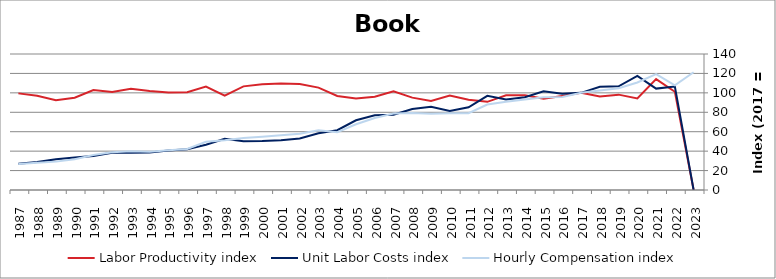
| Category | Labor Productivity index | Unit Labor Costs index | Hourly Compensation index |
|---|---|---|---|
| 2023.0 | 0 | 0 | 121.183 |
| 2022.0 | 101.165 | 106.477 | 107.717 |
| 2021.0 | 114.195 | 104.382 | 119.199 |
| 2020.0 | 94.216 | 117.429 | 110.637 |
| 2019.0 | 98.167 | 106.733 | 104.776 |
| 2018.0 | 96.361 | 106.322 | 102.453 |
| 2017.0 | 100 | 100 | 100 |
| 2016.0 | 96.762 | 99.032 | 95.825 |
| 2015.0 | 93.862 | 101.633 | 95.395 |
| 2014.0 | 97.542 | 95.531 | 93.183 |
| 2013.0 | 97.541 | 93.22 | 90.928 |
| 2012.0 | 90.743 | 96.927 | 87.955 |
| 2011.0 | 92.852 | 85.19 | 79.1 |
| 2010.0 | 97.183 | 81.26 | 78.971 |
| 2009.0 | 91.659 | 85.734 | 78.582 |
| 2008.0 | 95.104 | 83.298 | 79.22 |
| 2007.0 | 101.642 | 77.407 | 78.678 |
| 2006.0 | 96.106 | 77.033 | 74.034 |
| 2005.0 | 94.225 | 71.781 | 67.636 |
| 2004.0 | 96.797 | 61.511 | 59.541 |
| 2003.0 | 105.394 | 58.322 | 61.468 |
| 2002.0 | 109.127 | 53.08 | 57.925 |
| 2001.0 | 109.714 | 51.336 | 56.323 |
| 2000.0 | 108.96 | 50.367 | 54.88 |
| 1999.0 | 106.687 | 50.241 | 53.601 |
| 1998.0 | 97.143 | 52.789 | 51.281 |
| 1997.0 | 106.49 | 46.661 | 49.689 |
| 1996.0 | 100.729 | 41.929 | 42.235 |
| 1995.0 | 100.402 | 40.674 | 40.838 |
| 1994.0 | 101.813 | 38.662 | 39.363 |
| 1993.0 | 104.108 | 38.312 | 39.886 |
| 1992.0 | 100.991 | 38.414 | 38.795 |
| 1991.0 | 102.824 | 35.062 | 36.053 |
| 1990.0 | 94.991 | 33.378 | 31.706 |
| 1989.0 | 92.429 | 31.604 | 29.211 |
| 1988.0 | 96.978 | 28.883 | 28.011 |
| 1987.0 | 99.469 | 26.948 | 26.805 |